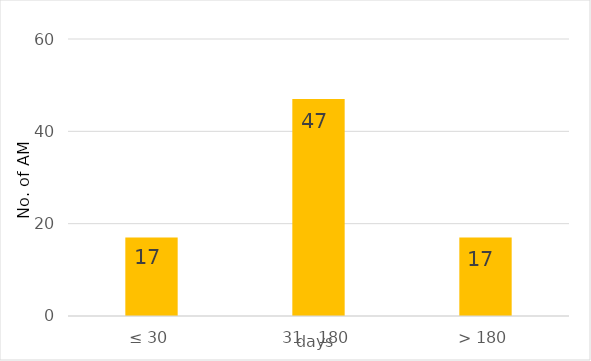
| Category | Series 0 |
|---|---|
| 0 | 17 |
| 1 | 47 |
| 2 | 17 |